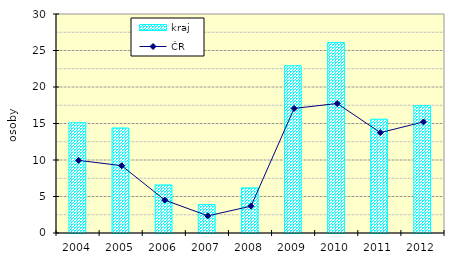
| Category | kraj |
|---|---|
| 2004.0 | 15.104 |
| 2005.0 | 14.384 |
| 2006.0 | 6.584 |
| 2007.0 | 3.902 |
| 2008.0 | 6.181 |
| 2009.0 | 22.911 |
| 2010.0 | 26.09 |
| 2011.0 | 15.585 |
| 2012.0 | 17.436 |